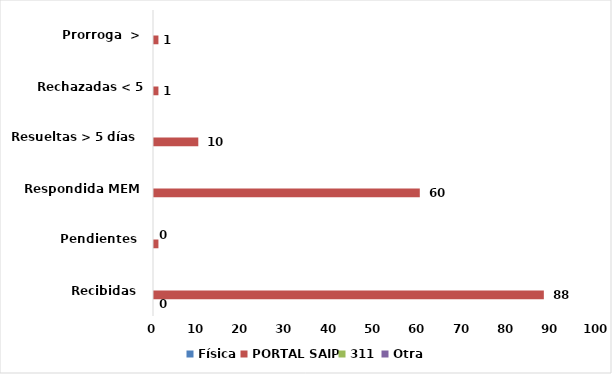
| Category | Física | PORTAL SAIP | 311 | Otra |
|---|---|---|---|---|
| Recibidas  | 0 | 88 | 0 | 0 |
| Pendientes  | 0 | 1 | 0 | 0 |
| Respondida MEM | 0 | 60 | 0 | 0 |
| Resueltas > 5 días  | 0 | 10 | 0 | 0 |
| Rechazadas < 5 días  | 0 | 1 | 0 | 0 |
| Prorroga  > | 0 | 1 | 0 | 0 |